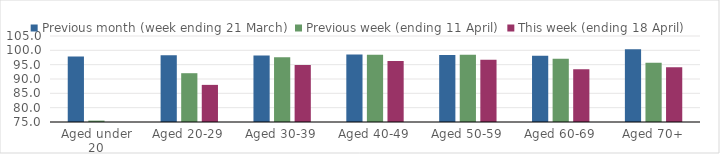
| Category | Previous month (week ending 21 March) | Previous week (ending 11 April) | This week (ending 18 April) |
|---|---|---|---|
| Aged under 20 | 97.849 | 75.489 | 72.612 |
| Aged 20-29 | 98.319 | 92.023 | 87.95 |
| Aged 30-39 | 98.237 | 97.581 | 94.907 |
| Aged 40-49 | 98.542 | 98.46 | 96.242 |
| Aged 50-59 | 98.373 | 98.433 | 96.677 |
| Aged 60-69 | 98.124 | 97.064 | 93.43 |
| Aged 70+ | 100.355 | 95.673 | 94.114 |